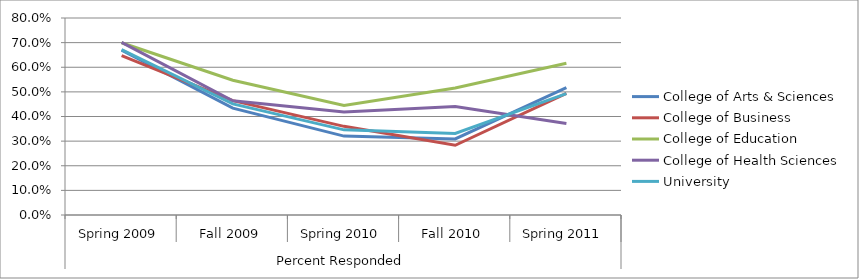
| Category | College of Arts & Sciences | College of Business | College of Education | College of Health Sciences | University |
|---|---|---|---|---|---|
| 0 | 0.67 | 0.647 | 0.7 | 0.701 | 0.672 |
| 1 | 0.434 | 0.464 | 0.547 | 0.464 | 0.451 |
| 2 | 0.32 | 0.36 | 0.445 | 0.418 | 0.346 |
| 3 | 0.309 | 0.283 | 0.516 | 0.441 | 0.331 |
| 4 | 0.517 | 0.494 | 0.617 | 0.372 | 0.493 |